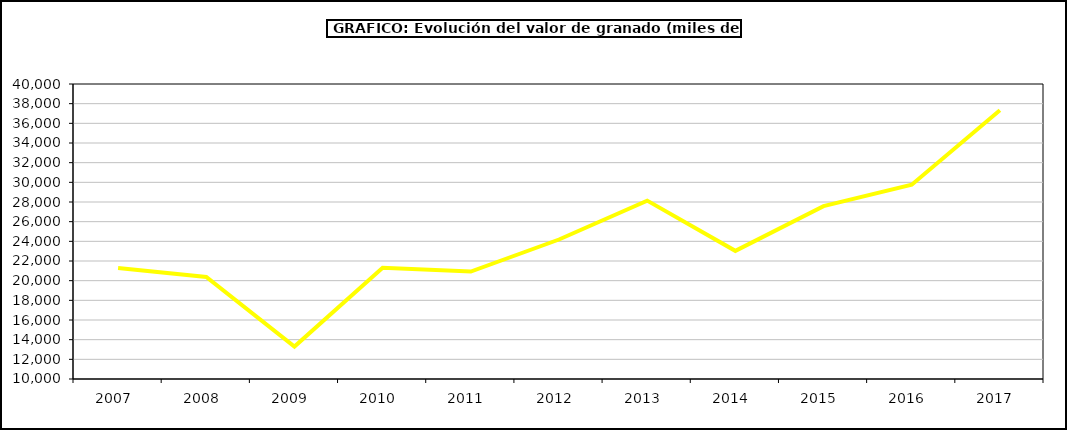
| Category | valor granado |
|---|---|
| 2007.0 | 21277.123 |
| 2008.0 | 20377.136 |
| 2009.0 | 13295.125 |
| 2010.0 | 21318.764 |
| 2011.0 | 20923.27 |
| 2012.0 | 24185.236 |
| 2013.0 | 28138.938 |
| 2014.0 | 23031.365 |
| 2015.0 | 27581 |
| 2016.0 | 29763 |
| 2017.0 | 37333.028 |